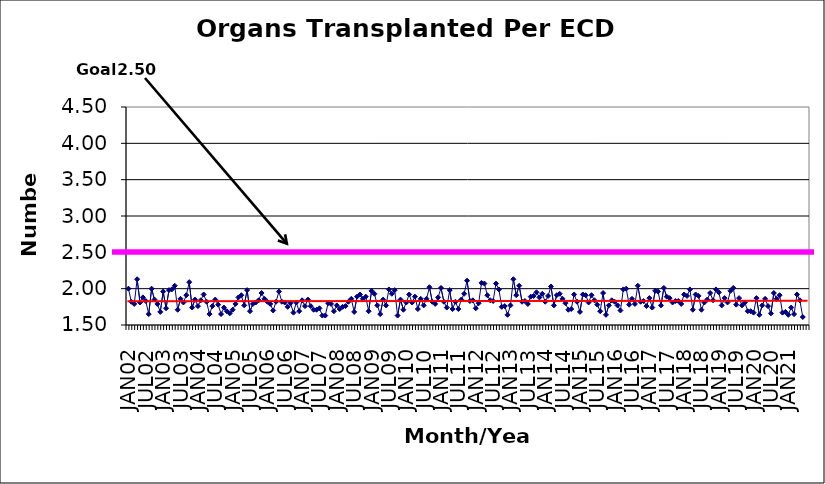
| Category | Series 0 |
|---|---|
| JAN02 | 2 |
| FEB02 | 1.82 |
| MAR02 | 1.79 |
| APR02 | 2.13 |
| MAY02 | 1.81 |
| JUN02 | 1.88 |
| JUL02 | 1.83 |
| AUG02 | 1.65 |
| SEP02 | 2 |
| OCT02 | 1.85 |
| NOV02 | 1.79 |
| DEC02 | 1.68 |
| JAN03 | 1.96 |
| FEB03 | 1.73 |
| MAR03 | 1.98 |
| APR03 | 1.99 |
| MAY03 | 2.04 |
| JUN03 | 1.71 |
| JUL03 | 1.86 |
| AUG03 | 1.81 |
| SEP03 | 1.91 |
| OCT03 | 2.09 |
| NOV03 | 1.74 |
| DEC03 | 1.85 |
| JAN04 | 1.76 |
| FEB04 | 1.84 |
| MAR04 | 1.92 |
| APR04 | 1.82 |
| MAY04 | 1.65 |
| JUN04 | 1.76 |
| JUL04 | 1.85 |
| AUG04 | 1.78 |
| SEP04 | 1.65 |
| OCT04 | 1.74 |
| NOV04 | 1.69 |
| DEC04 | 1.66 |
| JAN05 | 1.71 |
| FEB05 | 1.79 |
| MAR05 | 1.88 |
| APR05 | 1.91 |
| MAY05 | 1.77 |
| JUN05 | 1.98 |
| JUL05 | 1.69 |
| AUG05 | 1.79 |
| SEP05 | 1.81 |
| OCT05 | 1.84 |
| NOV05 | 1.94 |
| DEC05 | 1.86 |
| JAN06 | 1.82 |
| FEB06 | 1.79 |
| MAR06 | 1.7 |
| APR06 | 1.82 |
| MAY06 | 1.96 |
| JUN06 | 1.82 |
| JUL06 | 1.81 |
| AUG06 | 1.75 |
| SEP06 | 1.8 |
| OCT06 | 1.67 |
| NOV06 | 1.81 |
| DEC06 | 1.69 |
| JAN07 | 1.84 |
| FEB07 | 1.76 |
| MAR07 | 1.85 |
| APR07 | 1.76 |
| MAY07 | 1.71 |
| JUN07 | 1.71 |
| JUL07 | 1.73 |
| AUG07 | 1.63 |
| SEP07 | 1.63 |
| OCT07 | 1.8 |
| NOV07 | 1.79 |
| DEC07 | 1.69 |
| JAN08 | 1.77 |
| FEB08 | 1.72 |
| MAR08 | 1.75 |
| APR08 | 1.76 |
| MAY08 | 1.82 |
| JUN08 | 1.86 |
| JUL08 | 1.68 |
| AUG08 | 1.89 |
| SEP08 | 1.92 |
| OCT08 | 1.86 |
| NOV08 | 1.89 |
| DEC08 | 1.69 |
| JAN09 | 1.97 |
| FEB09 | 1.93 |
| MAR09 | 1.77 |
| APR09 | 1.65 |
| MAY09 | 1.85 |
| JUN09 | 1.77 |
| JUL09 | 1.99 |
| AUG09 | 1.93 |
| SEP09 | 1.98 |
| OCT09 | 1.63 |
| NOV09 | 1.85 |
| DEC09 | 1.71 |
| JAN10 | 1.81 |
| FEB10 | 1.92 |
| MAR10 | 1.81 |
| APR10 | 1.89 |
| MAY10 | 1.72 |
| JUN10 | 1.86 |
| JUL10 | 1.77 |
| AUG10 | 1.86 |
| SEP10 | 2.02 |
| OCT10 | 1.82 |
| NOV10 | 1.79 |
| DEC10 | 1.88 |
| JAN11 | 2.01 |
| FEB11 | 1.82 |
| MAR11 | 1.74 |
| APR11 | 1.98 |
| MAY11 | 1.72 |
| JUN11 | 1.82 |
| JUL11 | 1.72 |
| AUG11 | 1.85 |
| SEP11 | 1.93 |
| OCT11 | 2.11 |
| NOV11 | 1.83 |
| DEC11 | 1.84 |
| JAN12 | 1.73 |
| FEB12 | 1.8 |
| MAR12 | 2.08 |
| APR12 | 2.07 |
| MAY12 | 1.91 |
| JUN12 | 1.84 |
| JUL12 | 1.83 |
| AUG12 | 2.07 |
| SEP12 | 1.99 |
| OCT12 | 1.75 |
| NOV12 | 1.76 |
| DEC12 | 1.64 |
| JAN13 | 1.77 |
| FEB13 | 2.13 |
| MAR13 | 1.91 |
| APR13 | 2.04 |
| MAY13 | 1.82 |
| JUN13 | 1.83 |
| JUL13 | 1.79 |
| AUG13 | 1.89 |
| SEP13 | 1.9 |
| OCT13 | 1.95 |
| NOV13 | 1.88 |
| DEC13 | 1.93 |
| JAN14 | 1.82 |
| FEB14 | 1.9 |
| MAR14 | 2.03 |
| APR14 | 1.77 |
| MAY14 | 1.91 |
| JUN14 | 1.93 |
| JUL14 | 1.86 |
| AUG14 | 1.8 |
| SEP14 | 1.71 |
| OCT14 | 1.72 |
| NOV14 | 1.92 |
| DEC14 | 1.82 |
| JAN15 | 1.68 |
| FEB15 | 1.92 |
| MAR15 | 1.91 |
| APR15 | 1.81 |
| MAY15 | 1.91 |
| JUN15 | 1.84 |
| JUL15 | 1.78 |
| AUG15 | 1.69 |
| SEP15 | 1.94 |
| OCT15 | 1.64 |
| NOV15 | 1.77 |
| DEC15 | 1.84 |
| JAN16 | 1.82 |
| FEB16 | 1.77 |
| MAR16 | 1.7 |
| APR16 | 1.99 |
| MAY16 | 2 |
| JUN16 | 1.78 |
| JUL16 | 1.86 |
| AUG16 | 1.79 |
| SEP16 | 2.04 |
| OCT16 | 1.82 |
| NOV16 | 1.83 |
| DEC16 | 1.76 |
| JAN17 | 1.87 |
| FEB17 | 1.74 |
| MAR17 | 1.97 |
| APR17 | 1.96 |
| MAY17 | 1.77 |
| JUN17 | 2.01 |
| JUL17 | 1.89 |
| AUG17 | 1.87 |
| SEP17 | 1.81 |
| OCT17 | 1.83 |
| NOV17 | 1.83 |
| DEC17 | 1.79 |
| JAN18 | 1.92 |
| FEB18 | 1.9 |
| MAR18 | 1.99 |
| APR18 | 1.71 |
| MAY18 | 1.92 |
| JUN18 | 1.9 |
| JUL18 | 1.71 |
| AUG18 | 1.81 |
| SEP18 | 1.85 |
| OCT18 | 1.94 |
| NOV18 | 1.84 |
| DEC18 | 1.99 |
| JAN19 | 1.95 |
| FEB19 | 1.77 |
| MAR19 | 1.87 |
| APR19 | 1.81 |
| MAY19 | 1.97 |
| JUN19 | 2.01 |
| JUL19 | 1.78 |
| AUG19 | 1.87 |
| SEP19 | 1.77 |
| OCT19 | 1.81 |
| NOV19 | 1.69 |
| DEC19 | 1.69 |
| JAN20 | 1.67 |
| FEB20 | 1.87 |
| MAR20 | 1.64 |
| APR20 | 1.77 |
| MAY20 | 1.86 |
| JUN20 | 1.76 |
| JUL20 | 1.66 |
| AUG20 | 1.94 |
| SEP20 | 1.86 |
| OCT20 | 1.91 |
| NOV20 | 1.67 |
| DEC20 | 1.68 |
| JAN21 | 1.64 |
| FEB21 | 1.74 |
| MAR21 | 1.65 |
| APR21 | 1.92 |
| MAY21 | 1.84 |
| JUN21 | 1.61 |